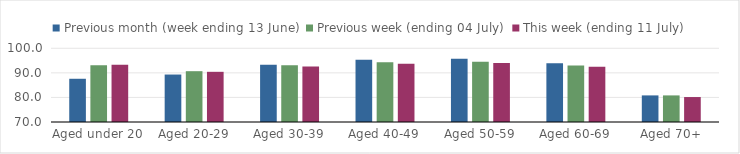
| Category | Previous month (week ending 13 June) | Previous week (ending 04 July) | This week (ending 11 July) |
|---|---|---|---|
| Aged under 20 | 87.594 | 93.141 | 93.327 |
| Aged 20-29 | 89.317 | 90.68 | 90.423 |
| Aged 30-39 | 93.293 | 93.077 | 92.566 |
| Aged 40-49 | 95.367 | 94.317 | 93.738 |
| Aged 50-59 | 95.779 | 94.479 | 94.058 |
| Aged 60-69 | 93.929 | 93.007 | 92.498 |
| Aged 70+ | 80.824 | 80.824 | 80.158 |